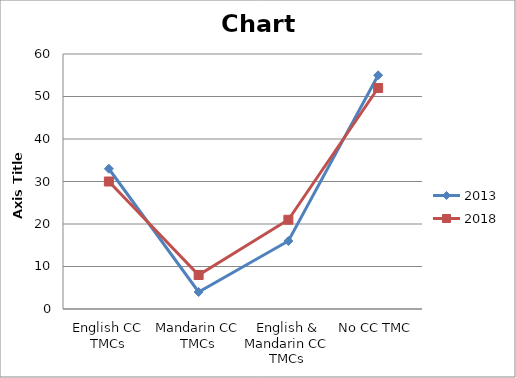
| Category | 2013 | 2018 |
|---|---|---|
| English CC TMCs | 33 | 30 |
| Mandarin CC TMCs | 4 | 8 |
| English & Mandarin CC TMCs | 16 | 21 |
| No CC TMC | 55 | 52 |